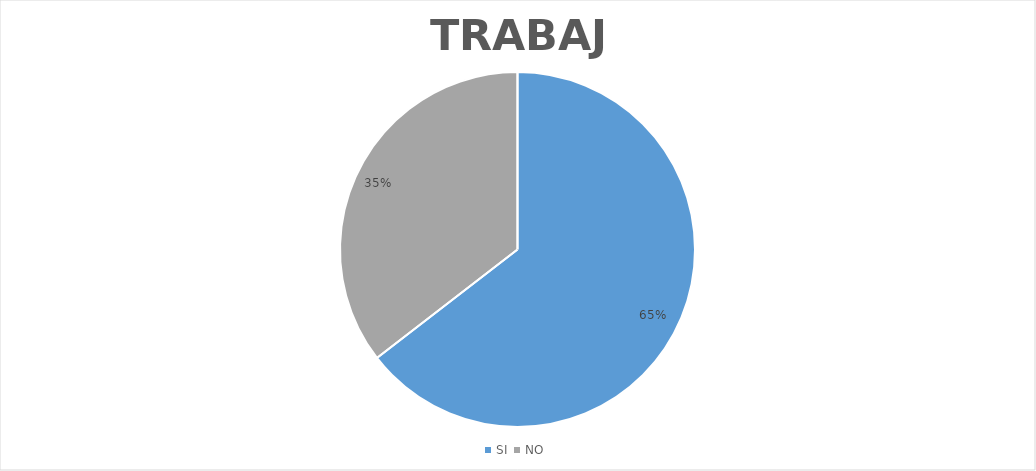
| Category | Series 0 |
|---|---|
| SI  | 344 |
| NO  | 189 |